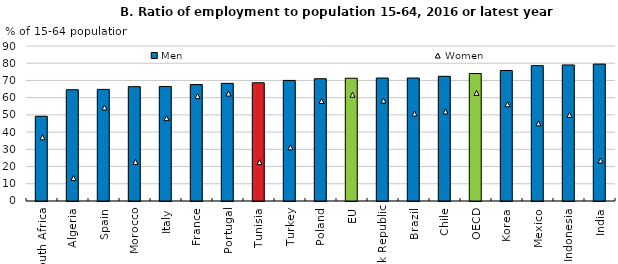
| Category | Men |
|---|---|
| South Africa | 49.2 |
| Algeria | 64.6 |
| Spain | 64.8 |
| Morocco | 66.4 |
| Italy | 66.5 |
| France | 67.6 |
| Portugal | 68.3 |
| Tunisia | 68.645 |
| Turkey | 70 |
| Poland | 71 |
| EU | 71.276 |
| Slovak Republic | 71.4 |
| Brazil | 71.4 |
| Chile | 72.4 |
| OECD | 74.02 |
| Korea | 75.8 |
| Mexico | 78.6 |
| Indonesia | 79 |
| India | 79.5 |